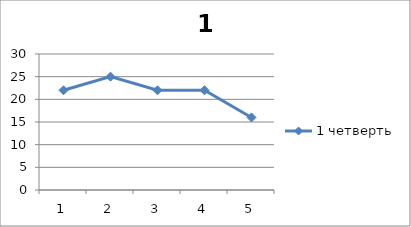
| Category | 1 четверть |
|---|---|
| 0 | 22 |
| 1 | 25 |
| 2 | 22 |
| 3 | 22 |
| 4 | 16 |